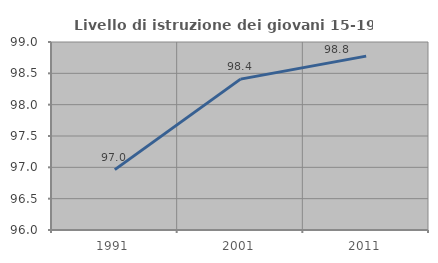
| Category | Livello di istruzione dei giovani 15-19 anni |
|---|---|
| 1991.0 | 96.963 |
| 2001.0 | 98.408 |
| 2011.0 | 98.775 |